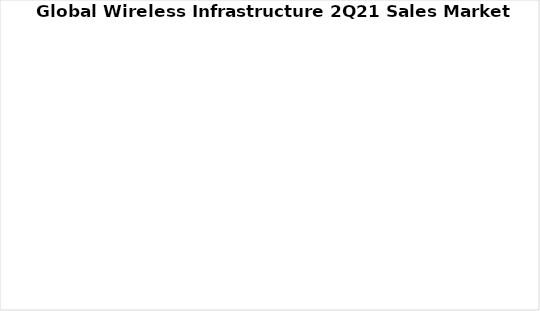
| Category | Series 0 | Series 1 |
|---|---|---|
| Cisco | 0 | 0 |
| Ericsson | 0 | 0 |
| Fujitsu | 0 | 0 |
| Huawei | 0 | 0 |
| Mavenir | 0 | 0 |
| NEC | 0 | 0 |
| Nokia | 0 | 0 |
| Samsung | 0 | 0 |
| ZTE | 0 | 0 |
| Other | 0 | 0 |